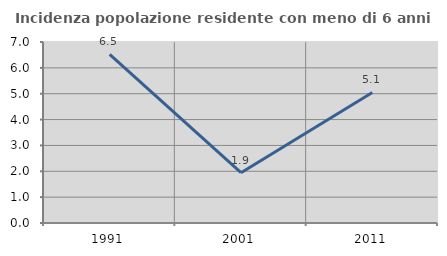
| Category | Incidenza popolazione residente con meno di 6 anni |
|---|---|
| 1991.0 | 6.522 |
| 2001.0 | 1.946 |
| 2011.0 | 5.051 |